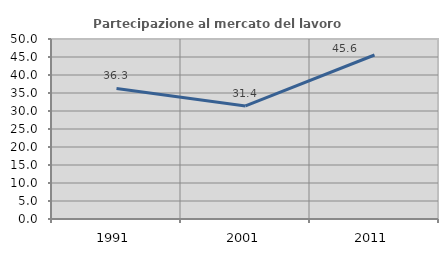
| Category | Partecipazione al mercato del lavoro  femminile |
|---|---|
| 1991.0 | 36.275 |
| 2001.0 | 31.395 |
| 2011.0 | 45.556 |